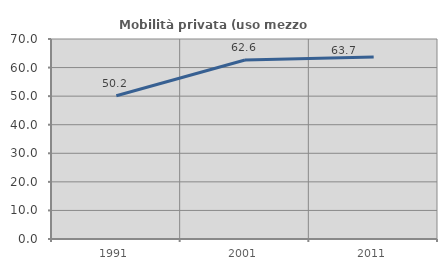
| Category | Mobilità privata (uso mezzo privato) |
|---|---|
| 1991.0 | 50.151 |
| 2001.0 | 62.641 |
| 2011.0 | 63.659 |